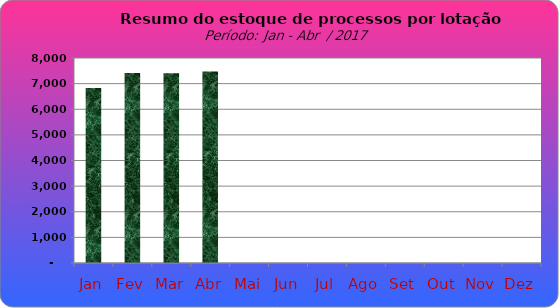
| Category | Series 0 |
|---|---|
| Jan | 6829 |
| Fev | 7414 |
| Mar | 7401 |
| Abr | 7477 |
| Mai | 0 |
| Jun | 0 |
| Jul | 0 |
| Ago | 0 |
| Set | 0 |
| Out | 0 |
| Nov | 0 |
| Dez | 0 |